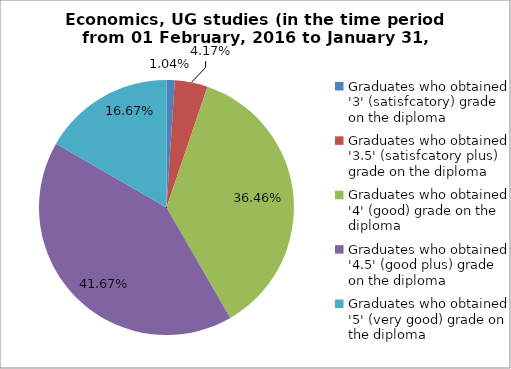
| Category | Series 0 |
|---|---|
| Graduates who obtained '3' (satisfcatory) grade on the diploma | 1.042 |
| Graduates who obtained '3.5' (satisfcatory plus) grade on the diploma | 4.167 |
| Graduates who obtained '4' (good) grade on the diploma | 36.458 |
| Graduates who obtained '4.5' (good plus) grade on the diploma | 41.667 |
| Graduates who obtained '5' (very good) grade on the diploma | 16.667 |